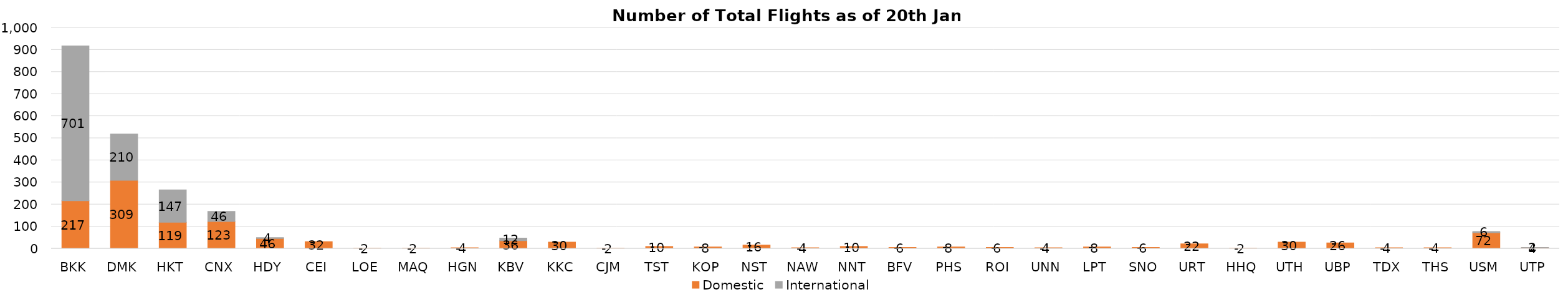
| Category | Domestic | International |
|---|---|---|
| BKK | 217 | 701 |
| DMK | 309 | 210 |
| HKT | 119 | 147 |
| CNX | 123 | 46 |
| HDY | 46 | 4 |
| CEI | 32 | 0 |
| LOE | 2 | 0 |
| MAQ | 2 | 0 |
| HGN | 4 | 0 |
| KBV | 36 | 12 |
| KKC | 30 | 0 |
| CJM | 2 | 0 |
| TST | 10 | 0 |
| KOP | 8 | 0 |
| NST | 16 | 0 |
| NAW | 4 | 0 |
| NNT | 10 | 0 |
| BFV | 6 | 0 |
| PHS | 8 | 0 |
| ROI | 6 | 0 |
| UNN | 4 | 0 |
| LPT | 8 | 0 |
| SNO | 6 | 0 |
| URT | 22 | 0 |
| HHQ | 2 | 0 |
| UTH | 30 | 0 |
| UBP | 26 | 0 |
| TDX | 4 | 0 |
| THS | 4 | 0 |
| USM | 72 | 6 |
| UTP | 4 | 2 |